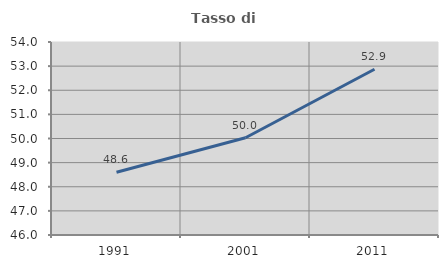
| Category | Tasso di occupazione   |
|---|---|
| 1991.0 | 48.6 |
| 2001.0 | 50.032 |
| 2011.0 | 52.869 |